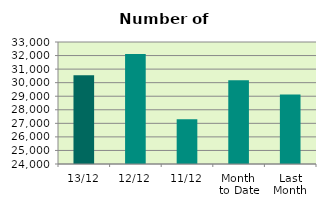
| Category | Series 0 |
|---|---|
| 13/12 | 30540 |
| 12/12 | 32118 |
| 11/12 | 27304 |
| Month 
to Date | 30187.333 |
| Last
Month | 29125.182 |